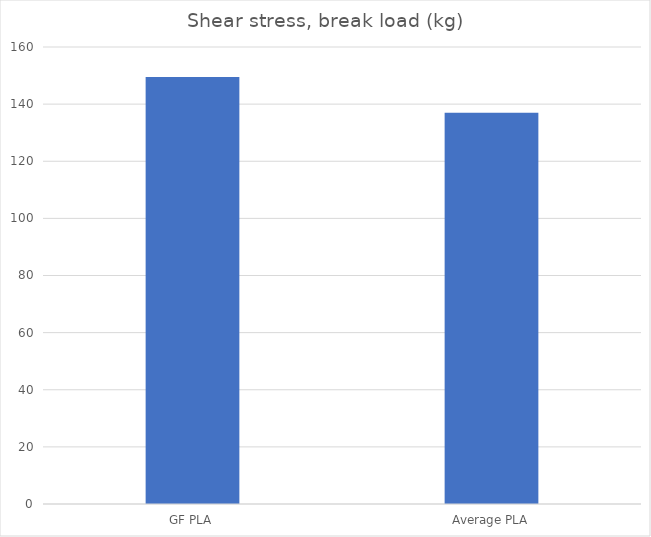
| Category | Break kg |
|---|---|
| GF PLA | 149.5 |
| Average PLA | 137 |